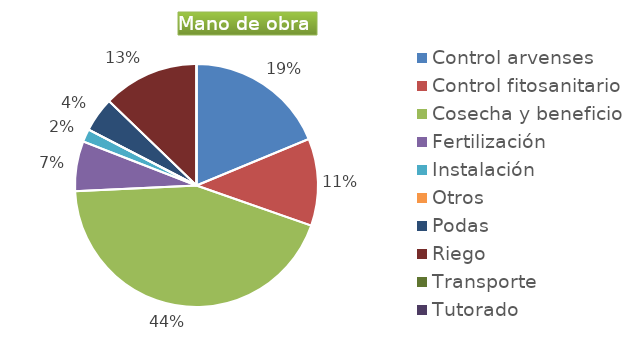
| Category | Series 0 |
|---|---|
| Control arvenses | 13839820 |
| Control fitosanitario | 8555488 |
| Cosecha y beneficio | 32395937.968 |
| Fertilización | 4906824 |
| Instalación | 1258160 |
| Otros | 0 |
| Podas | 3397032 |
| Riego | 9436200 |
| Transporte | 0 |
| Tutorado | 0 |